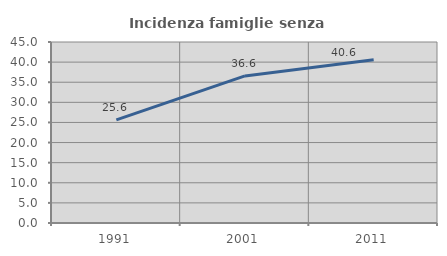
| Category | Incidenza famiglie senza nuclei |
|---|---|
| 1991.0 | 25.648 |
| 2001.0 | 36.569 |
| 2011.0 | 40.608 |